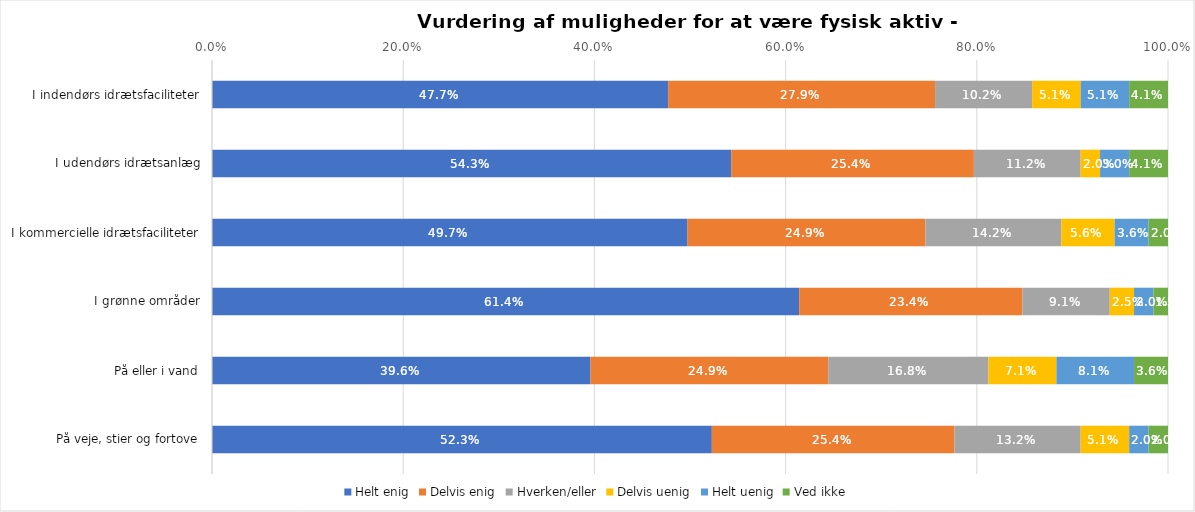
| Category | Helt enig | Delvis enig | Hverken/eller | Delvis uenig | Helt uenig | Ved ikke |
|---|---|---|---|---|---|---|
| I indendørs idrætsfaciliteter | 0.477 | 0.279 | 0.102 | 0.051 | 0.051 | 0.041 |
| I udendørs idrætsanlæg | 0.543 | 0.254 | 0.112 | 0.02 | 0.03 | 0.041 |
| I kommercielle idrætsfaciliteter | 0.497 | 0.249 | 0.142 | 0.056 | 0.036 | 0.02 |
| I grønne områder | 0.614 | 0.234 | 0.091 | 0.025 | 0.02 | 0.015 |
| På eller i vand | 0.396 | 0.249 | 0.168 | 0.071 | 0.081 | 0.036 |
| På veje, stier og fortove | 0.523 | 0.254 | 0.132 | 0.051 | 0.02 | 0.02 |